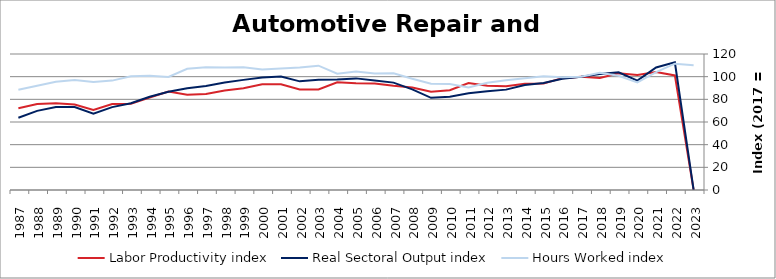
| Category | Labor Productivity index | Real Sectoral Output index | Hours Worked index |
|---|---|---|---|
| 2023.0 | 0 | 0 | 110.013 |
| 2022.0 | 101.091 | 112.648 | 111.432 |
| 2021.0 | 104.001 | 108.096 | 103.937 |
| 2020.0 | 101.568 | 96.465 | 94.975 |
| 2019.0 | 102.924 | 103.785 | 100.837 |
| 2018.0 | 98.862 | 102.299 | 103.476 |
| 2017.0 | 100 | 100 | 100 |
| 2016.0 | 98.682 | 98.128 | 99.438 |
| 2015.0 | 93.982 | 94.347 | 100.389 |
| 2014.0 | 93.847 | 92.612 | 98.684 |
| 2013.0 | 91.509 | 88.56 | 96.778 |
| 2012.0 | 92.033 | 87.032 | 94.567 |
| 2011.0 | 94.458 | 85.371 | 90.38 |
| 2010.0 | 88.007 | 82.37 | 93.594 |
| 2009.0 | 86.762 | 81.3 | 93.705 |
| 2008.0 | 90.458 | 88.8 | 98.167 |
| 2007.0 | 91.954 | 94.758 | 103.049 |
| 2006.0 | 93.94 | 96.567 | 102.796 |
| 2005.0 | 94.262 | 98.487 | 104.483 |
| 2004.0 | 95.06 | 97.604 | 102.676 |
| 2003.0 | 88.699 | 97.295 | 109.691 |
| 2002.0 | 88.655 | 95.866 | 108.134 |
| 2001.0 | 93.324 | 100.091 | 107.251 |
| 2000.0 | 93.358 | 99.355 | 106.424 |
| 1999.0 | 89.787 | 97.175 | 108.229 |
| 1998.0 | 87.802 | 94.853 | 108.031 |
| 1997.0 | 84.683 | 91.758 | 108.354 |
| 1996.0 | 83.952 | 89.845 | 107.019 |
| 1995.0 | 86.86 | 86.663 | 99.773 |
| 1994.0 | 81.581 | 82.252 | 100.823 |
| 1993.0 | 76.199 | 76.519 | 100.42 |
| 1992.0 | 75.791 | 73.151 | 96.516 |
| 1991.0 | 70.619 | 67.244 | 95.221 |
| 1990.0 | 75.341 | 73.175 | 97.124 |
| 1989.0 | 76.637 | 73.186 | 95.497 |
| 1988.0 | 75.911 | 69.801 | 91.951 |
| 1987.0 | 72.109 | 63.802 | 88.48 |